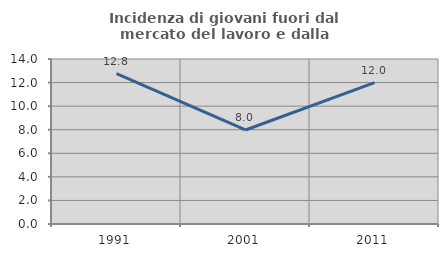
| Category | Incidenza di giovani fuori dal mercato del lavoro e dalla formazione  |
|---|---|
| 1991.0 | 12.764 |
| 2001.0 | 7.977 |
| 2011.0 | 11.994 |